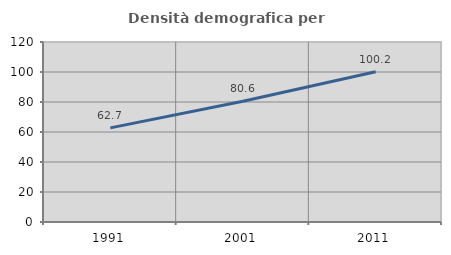
| Category | Densità demografica |
|---|---|
| 1991.0 | 62.735 |
| 2001.0 | 80.55 |
| 2011.0 | 100.219 |